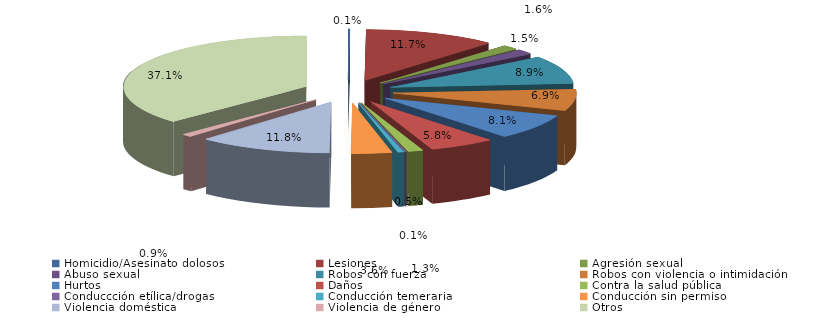
| Category | Series 0 |
|---|---|
| Homicidio/Asesinato dolosos | 1 |
| Lesiones | 88 |
| Agresión sexual | 11 |
| Abuso sexual | 12 |
| Robos con fuerza | 67 |
| Robos con violencia o intimidación | 52 |
| Hurtos | 61 |
| Daños | 44 |
| Contra la salud pública | 10 |
| Conduccción etílica/drogas | 1 |
| Conducción temeraria | 4 |
| Conducción sin permiso | 27 |
| Violencia doméstica | 89 |
| Violencia de género | 7 |
| Otros | 280 |